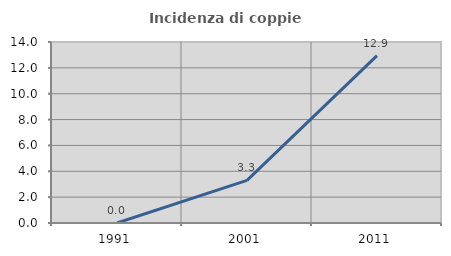
| Category | Incidenza di coppie miste |
|---|---|
| 1991.0 | 0 |
| 2001.0 | 3.297 |
| 2011.0 | 12.941 |